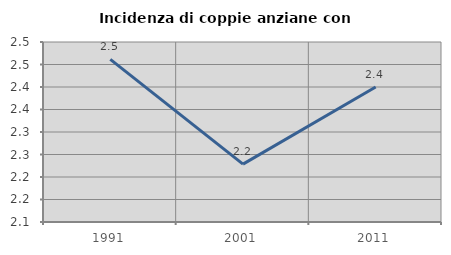
| Category | Incidenza di coppie anziane con figli |
|---|---|
| 1991.0 | 2.461 |
| 2001.0 | 2.229 |
| 2011.0 | 2.4 |